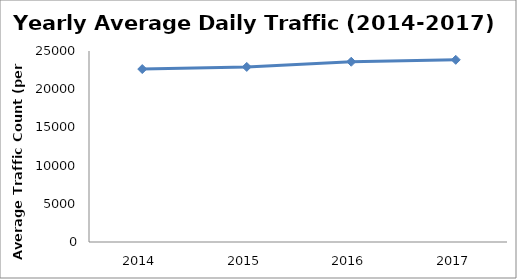
| Category | Series 0 |
|---|---|
| 2014.0 | 22636.529 |
| 2015.0 | 22915.57 |
| 2016.0 | 23594.139 |
| 2017.0 | 23845.814 |